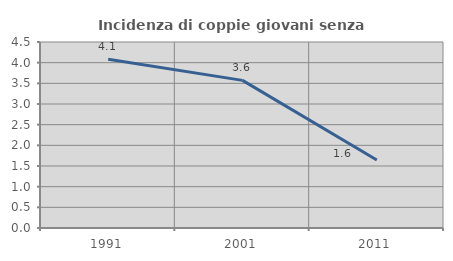
| Category | Incidenza di coppie giovani senza figli |
|---|---|
| 1991.0 | 4.081 |
| 2001.0 | 3.571 |
| 2011.0 | 1.645 |